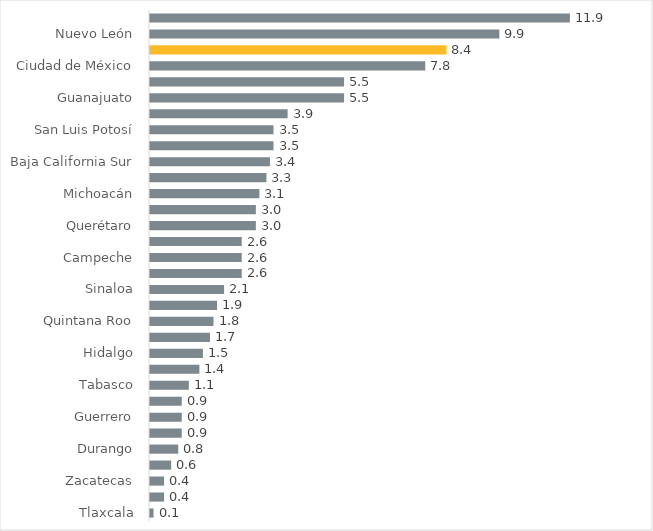
| Category | Distribución porcentual |
|---|---|
| Tlaxcala | 0.1 |
| Morelos | 0.4 |
| Zacatecas | 0.4 |
| Nayarit | 0.6 |
| Durango | 0.8 |
| Chiapas | 0.9 |
| Guerrero | 0.9 |
| Oaxaca | 0.9 |
| Tabasco | 1.1 |
| Aguascalientes | 1.4 |
| Hidalgo | 1.5 |
| Colima | 1.7 |
| Quintana Roo | 1.8 |
| Puebla | 1.9 |
| Sinaloa | 2.1 |
| Baja California | 2.6 |
| Campeche | 2.6 |
| Yucatán | 2.6 |
| Querétaro | 3 |
| Sonora | 3 |
| Michoacán | 3.1 |
| Coahuila | 3.3 |
| Baja California Sur | 3.4 |
| Chihuahua | 3.5 |
| San Luis Potosí | 3.5 |
| Tamaulipas | 3.9 |
| Guanajuato | 5.5 |
| Veracruz | 5.5 |
| Ciudad de México | 7.8 |
| Jalisco | 8.4 |
| Nuevo León | 9.9 |
| Estado de México | 11.9 |